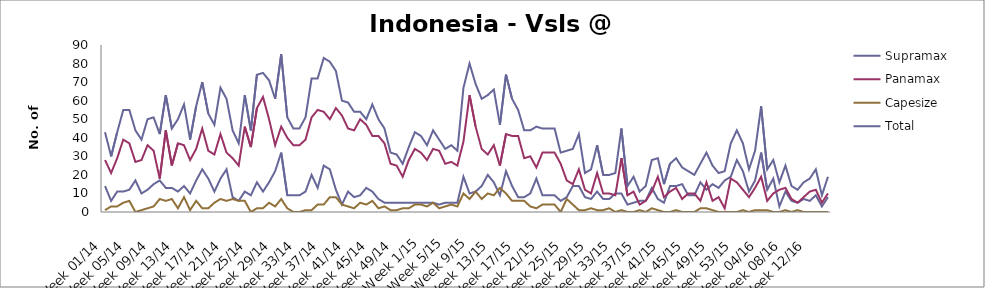
| Category | Supramax | Panamax | Capesize | Total |
|---|---|---|---|---|
| Week 01/14 | 14 | 28 | 1 | 43 |
| Week 02/14 | 6 | 21 | 3 | 30 |
| Week 03/14 | 11 | 29 | 3 | 43 |
| Week 04/14 | 11 | 39 | 5 | 55 |
| Week 05/14 | 12 | 37 | 6 | 55 |
| Week 06/14 | 17 | 27 | 0 | 44 |
| Week 07/14 | 10 | 28 | 1 | 39 |
| Week 08/14 | 12 | 36 | 2 | 50 |
| Week 09/14 | 15 | 33 | 3 | 51 |
| Week 10/14 | 17 | 18 | 7 | 42 |
| Week 11/14 | 13 | 44 | 6 | 63 |
| Week 12/14 | 13 | 25 | 7 | 45 |
| Week 13/14 | 11 | 37 | 2 | 50 |
| Week 14/14 | 14 | 36 | 8 | 58 |
| Week 15/14 | 10 | 28 | 1 | 39 |
| Week 16/14 | 17 | 34 | 6 | 57 |
| Week 17/14 | 23 | 45 | 2 | 70 |
| Week 18/14 | 18 | 33 | 2 | 53 |
| Week 19/14 | 11 | 31 | 5 | 47 |
| Week 20/14 | 18 | 42 | 7 | 67 |
| Week 21/14 | 23 | 32 | 6 | 61 |
| Week 22/14 | 8 | 29 | 7 | 44 |
| Week 23/14 | 6 | 25 | 6 | 37 |
| Week 24/14 | 11 | 46 | 6 | 63 |
| Week 25/14 | 9 | 35 | 0 | 44 |
| Week 26/14 | 16 | 56 | 2 | 74 |
| Week 27/14 | 11 | 62 | 2 | 75 |
| Week 28/14 | 16 | 50 | 5 | 71 |
| Week 29/14 | 22 | 36 | 3 | 61 |
| Week 30/14 | 32 | 46 | 7 | 85 |
| Week 31/14 | 9 | 40 | 2 | 51 |
| Week 32/14 | 9 | 36 | 0 | 45 |
| Week 33/14 | 9 | 36 | 0 | 45 |
| Week 34/14 | 11 | 39 | 1 | 51 |
| Week 35/14 | 20 | 51 | 1 | 72 |
| Week 36/14 | 13 | 55 | 4 | 72 |
| Week 37/14 | 25 | 54 | 4 | 83 |
| Week 38/14 | 23 | 50 | 8 | 81 |
| Week 39/14 | 12 | 56 | 8 | 76 |
| Week 40/14 | 4 | 52 | 4 | 60 |
| Week 41/14 | 11 | 45 | 3 | 59 |
| Week 42/14 | 8 | 44 | 2 | 54 |
| Week 43/14 | 9 | 50 | 5 | 54 |
| Week 44/14 | 13 | 47 | 4 | 50 |
| Week 45/14 | 11 | 41 | 6 | 58 |
| Week 46/14 | 7 | 41 | 2 | 50 |
| Week 47/14 | 5 | 37 | 3 | 45 |
| Week 48/14 | 5 | 26 | 1 | 32 |
| Week 49/14 | 5 | 25 | 1 | 31 |
| Week 50/14 | 5 | 19 | 2 | 26 |
| Week 51/14 | 5 | 28 | 2 | 35 |
| Week 52/14 | 5 | 34 | 4 | 43 |
| Week 1/15 | 5 | 32 | 4 | 41 |
| Week 2/15 | 5 | 28 | 3 | 36 |
| Week 3/15 | 5 | 34 | 5 | 44 |
| Week 4/15 | 4 | 33 | 2 | 39 |
| Week 5/15 | 5 | 26 | 3 | 34 |
| Week 6/15 | 5 | 27 | 4 | 36 |
| Week 7/15 | 5 | 25 | 3 | 33 |
| Week 8/15 | 19 | 38 | 10 | 67 |
| Week 9/15 | 10 | 63 | 7 | 80 |
| Week 10/15 | 11 | 46 | 11 | 69 |
| Week 11/15 | 14 | 34 | 7 | 61 |
| Week 12/15 | 20 | 31 | 10 | 63 |
| Week 13/15 | 16 | 36 | 9 | 66 |
| Week 14/15 | 9 | 25 | 13 | 47 |
| Week 15/15 | 22 | 42 | 10 | 74 |
| Week 16/15 | 14 | 41 | 6 | 61 |
| Week 17/15 | 8 | 41 | 6 | 55 |
| Week 18/15 | 8 | 29 | 6 | 44 |
| Week 19/15 | 10 | 30 | 3 | 44 |
| Week 20/15 | 18 | 24 | 2 | 46 |
| Week 21/15 | 9 | 32 | 4 | 45 |
| Week 22/15 | 9 | 32 | 4 | 45 |
| Week 23/15 | 9 | 32 | 4 | 45 |
| Week 24/15 | 6 | 26 | 0 | 32 |
| Week 25/15 | 8 | 17 | 7 | 33 |
| Week 26/15 | 14 | 15 | 4 | 34 |
| Week 27/15 | 14 | 23 | 1 | 42 |
| Week 28/15 | 8 | 12 | 1 | 21 |
| Week 29/15 | 7 | 10 | 2 | 23 |
| Week 30/15 | 11 | 21 | 1 | 36 |
| Week 31/15 | 7 | 10 | 1 | 20 |
| Week 32/15 | 7 | 10 | 2 | 20 |
| Week 33/15 | 10 | 9 | 0 | 21 |
| Week 34/15 | 10 | 29 | 1 | 45 |
| Week 35/15 | 4 | 9 | 0 | 14 |
| Week 36/15 | 5 | 11 | 0 | 19 |
| Week 37/15 | 6 | 4 | 1 | 11 |
| Week 38/15 | 6 | 6 | 0 | 14 |
| Week 39/15 | 13 | 11 | 2 | 28 |
| Week 40/15 | 7 | 19 | 1 | 29 |
| Week 41/15 | 5 | 8 | 0 | 15 |
| Week 42/15 | 14 | 11 | 0 | 26 |
| Week 43/15 | 14 | 13 | 1 | 29 |
| Week 44/15 | 15 | 7 | 0 | 24 |
| Week 45/15 | 9 | 10 | 0 | 22 |
| Week 46/15 | 9 | 10 | 0 | 20 |
| Week 47/15 | 16 | 6 | 2 | 26 |
| Week 48/15 | 12 | 16 | 2 | 32 |
| Week 49/15 | 15 | 6 | 1 | 25 |
| Week 50/15 | 13 | 8 | 0 | 21 |
| Week 51/15 | 17 | 2 | 0 | 22 |
| Week 52/15 | 19 | 18 | 0 | 37 |
| Week 53/15 | 28 | 16 | 0 | 44 |
| Week 01/16 | 22 | 12 | 1 | 37 |
| Week 02/16 | 11 | 8 | 0 | 23 |
| Week 03/16 | 17 | 13 | 1 | 33 |
| Week 04/16 | 32 | 19 | 1 | 57 |
| Week 05/16 | 12 | 6 | 1 | 23 |
| Week 06/16 | 18 | 10 | 0 | 28 |
| Week 07/16 | 3 | 12 | 0 | 16 |
| Week 08/16 | 11 | 13 | 1 | 25 |
| Week 09/16 | 6 | 7 | 0 | 14 |
| Week 10/16 | 5 | 5 | 1 | 12 |
| Week 11/16 | 7 | 8 | 0 | 16 |
| Week 12/16 | 6 | 11 | 0 | 18 |
| Week 13/16 | 9 | 12 | 0 | 23 |
| Week 14/16 | 3 | 5 | 0 | 9 |